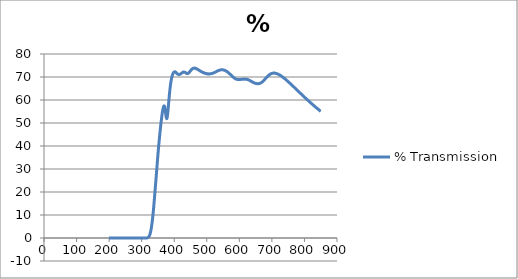
| Category | % Transmission |
|---|---|
| 850.0 | 55.093 |
| 849.0 | 55.172 |
| 848.0 | 55.34 |
| 847.0 | 55.429 |
| 846.0 | 55.517 |
| 845.0 | 55.6 |
| 844.0 | 55.826 |
| 843.0 | 55.848 |
| 842.0 | 56.032 |
| 841.0 | 56.143 |
| 840.0 | 56.236 |
| 839.0 | 56.34 |
| 838.0 | 56.465 |
| 837.0 | 56.565 |
| 836.0 | 56.703 |
| 835.0 | 56.844 |
| 834.0 | 56.947 |
| 833.0 | 57.083 |
| 832.0 | 57.176 |
| 831.0 | 57.297 |
| 830.0 | 57.442 |
| 829.0 | 57.563 |
| 828.0 | 57.641 |
| 827.0 | 57.807 |
| 826.0 | 57.919 |
| 825.0 | 58.056 |
| 824.0 | 58.169 |
| 823.0 | 58.321 |
| 822.0 | 58.401 |
| 821.0 | 58.522 |
| 820.0 | 58.689 |
| 819.0 | 58.756 |
| 818.0 | 58.904 |
| 817.0 | 59.019 |
| 816.0 | 59.156 |
| 815.0 | 59.295 |
| 814.0 | 59.434 |
| 813.0 | 59.566 |
| 812.0 | 59.705 |
| 811.0 | 59.828 |
| 810.0 | 59.941 |
| 809.0 | 60.076 |
| 808.0 | 60.173 |
| 807.0 | 60.359 |
| 806.0 | 60.467 |
| 805.0 | 60.612 |
| 804.0 | 60.729 |
| 803.0 | 60.873 |
| 802.0 | 60.963 |
| 801.0 | 61.109 |
| 800.0 | 61.269 |
| 799.0 | 61.376 |
| 798.0 | 61.522 |
| 797.0 | 61.657 |
| 796.0 | 61.763 |
| 795.0 | 61.901 |
| 794.0 | 62.059 |
| 793.0 | 62.186 |
| 792.0 | 62.341 |
| 791.0 | 62.46 |
| 790.0 | 62.595 |
| 789.0 | 62.729 |
| 788.0 | 62.89 |
| 787.0 | 62.999 |
| 786.0 | 63.148 |
| 785.0 | 63.27 |
| 784.0 | 63.4 |
| 783.0 | 63.551 |
| 782.0 | 63.673 |
| 781.0 | 63.826 |
| 780.0 | 63.949 |
| 779.0 | 64.107 |
| 778.0 | 64.192 |
| 777.0 | 64.368 |
| 776.0 | 64.504 |
| 775.0 | 64.627 |
| 774.0 | 64.774 |
| 773.0 | 64.925 |
| 772.0 | 65.028 |
| 771.0 | 65.17 |
| 770.0 | 65.334 |
| 769.0 | 65.443 |
| 768.0 | 65.603 |
| 767.0 | 65.726 |
| 766.0 | 65.85 |
| 765.0 | 65.993 |
| 764.0 | 66.155 |
| 763.0 | 66.261 |
| 762.0 | 66.41 |
| 761.0 | 66.547 |
| 760.0 | 66.639 |
| 759.0 | 66.801 |
| 758.0 | 66.952 |
| 757.0 | 67.084 |
| 756.0 | 67.212 |
| 755.0 | 67.343 |
| 754.0 | 67.445 |
| 753.0 | 67.586 |
| 752.0 | 67.717 |
| 751.0 | 67.841 |
| 750.0 | 67.983 |
| 749.0 | 68.107 |
| 748.0 | 68.205 |
| 747.0 | 68.344 |
| 746.0 | 68.482 |
| 745.0 | 68.612 |
| 744.0 | 68.735 |
| 743.0 | 68.857 |
| 742.0 | 68.937 |
| 741.0 | 69.092 |
| 740.0 | 69.214 |
| 739.0 | 69.337 |
| 738.0 | 69.45 |
| 737.0 | 69.561 |
| 736.0 | 69.636 |
| 735.0 | 69.789 |
| 734.0 | 69.886 |
| 733.0 | 69.977 |
| 732.0 | 70.091 |
| 731.0 | 70.191 |
| 730.0 | 70.294 |
| 729.0 | 70.418 |
| 728.0 | 70.479 |
| 727.0 | 70.569 |
| 726.0 | 70.69 |
| 725.0 | 70.784 |
| 724.0 | 70.827 |
| 723.0 | 70.924 |
| 722.0 | 71.015 |
| 721.0 | 71.096 |
| 720.0 | 71.172 |
| 719.0 | 71.238 |
| 718.0 | 71.277 |
| 717.0 | 71.352 |
| 716.0 | 71.443 |
| 715.0 | 71.482 |
| 714.0 | 71.521 |
| 713.0 | 71.55 |
| 712.0 | 71.564 |
| 711.0 | 71.628 |
| 710.0 | 71.665 |
| 709.0 | 71.688 |
| 708.0 | 71.708 |
| 707.0 | 71.719 |
| 706.0 | 71.679 |
| 705.0 | 71.7 |
| 704.0 | 71.698 |
| 703.0 | 71.644 |
| 702.0 | 71.649 |
| 701.0 | 71.587 |
| 700.0 | 71.546 |
| 699.0 | 71.522 |
| 698.0 | 71.467 |
| 697.0 | 71.399 |
| 696.0 | 71.32 |
| 695.0 | 71.224 |
| 694.0 | 71.104 |
| 693.0 | 71.053 |
| 692.0 | 70.964 |
| 691.0 | 70.837 |
| 690.0 | 70.736 |
| 689.0 | 70.597 |
| 688.0 | 70.445 |
| 687.0 | 70.276 |
| 686.0 | 70.183 |
| 685.0 | 70.042 |
| 684.0 | 69.864 |
| 683.0 | 69.727 |
| 682.0 | 69.544 |
| 681.0 | 69.385 |
| 680.0 | 69.247 |
| 679.0 | 69.081 |
| 678.0 | 68.898 |
| 677.0 | 68.751 |
| 676.0 | 68.594 |
| 675.0 | 68.442 |
| 674.0 | 68.31 |
| 673.0 | 68.181 |
| 672.0 | 68.039 |
| 671.0 | 67.925 |
| 670.0 | 67.802 |
| 669.0 | 67.697 |
| 668.0 | 67.634 |
| 667.0 | 67.525 |
| 666.0 | 67.423 |
| 665.0 | 67.359 |
| 664.0 | 67.293 |
| 663.0 | 67.234 |
| 662.0 | 67.199 |
| 661.0 | 67.184 |
| 660.0 | 67.153 |
| 659.0 | 67.128 |
| 658.0 | 67.096 |
| 657.0 | 67.075 |
| 656.0 | 67.092 |
| 655.0 | 67.111 |
| 654.0 | 67.117 |
| 653.0 | 67.129 |
| 652.0 | 67.139 |
| 651.0 | 67.166 |
| 650.0 | 67.237 |
| 649.0 | 67.277 |
| 648.0 | 67.307 |
| 647.0 | 67.369 |
| 646.0 | 67.42 |
| 645.0 | 67.481 |
| 644.0 | 67.555 |
| 643.0 | 67.642 |
| 642.0 | 67.697 |
| 641.0 | 67.774 |
| 640.0 | 67.848 |
| 639.0 | 67.923 |
| 638.0 | 68.022 |
| 637.0 | 68.077 |
| 636.0 | 68.159 |
| 635.0 | 68.252 |
| 634.0 | 68.318 |
| 633.0 | 68.389 |
| 632.0 | 68.473 |
| 631.0 | 68.568 |
| 630.0 | 68.622 |
| 629.0 | 68.691 |
| 628.0 | 68.749 |
| 627.0 | 68.813 |
| 626.0 | 68.884 |
| 625.0 | 68.911 |
| 624.0 | 68.96 |
| 623.0 | 68.993 |
| 622.0 | 69.009 |
| 621.0 | 69.053 |
| 620.0 | 69.081 |
| 619.0 | 69.068 |
| 618.0 | 69.073 |
| 617.0 | 69.084 |
| 616.0 | 69.065 |
| 615.0 | 69.064 |
| 614.0 | 69.062 |
| 613.0 | 69.062 |
| 612.0 | 69.046 |
| 611.0 | 69.051 |
| 610.0 | 69.027 |
| 609.0 | 69 |
| 608.0 | 69 |
| 607.0 | 68.993 |
| 606.0 | 68.977 |
| 605.0 | 68.959 |
| 604.0 | 68.928 |
| 603.0 | 68.908 |
| 602.0 | 68.925 |
| 601.0 | 68.91 |
| 600.0 | 68.913 |
| 599.0 | 68.928 |
| 598.0 | 68.905 |
| 597.0 | 68.9 |
| 596.0 | 68.92 |
| 595.0 | 68.934 |
| 594.0 | 68.938 |
| 593.0 | 68.974 |
| 592.0 | 68.996 |
| 591.0 | 69.032 |
| 590.0 | 69.116 |
| 589.0 | 69.175 |
| 588.0 | 69.228 |
| 587.0 | 69.332 |
| 586.0 | 69.408 |
| 585.0 | 69.506 |
| 584.0 | 69.629 |
| 583.0 | 69.731 |
| 582.0 | 69.838 |
| 581.0 | 69.97 |
| 580.0 | 70.087 |
| 579.0 | 70.222 |
| 578.0 | 70.358 |
| 577.0 | 70.509 |
| 576.0 | 70.653 |
| 575.0 | 70.776 |
| 574.0 | 70.911 |
| 573.0 | 71.025 |
| 572.0 | 71.187 |
| 571.0 | 71.316 |
| 570.0 | 71.421 |
| 569.0 | 71.576 |
| 568.0 | 71.679 |
| 567.0 | 71.798 |
| 566.0 | 71.952 |
| 565.0 | 72.066 |
| 564.0 | 72.168 |
| 563.0 | 72.283 |
| 562.0 | 72.347 |
| 561.0 | 72.467 |
| 560.0 | 72.519 |
| 559.0 | 72.626 |
| 558.0 | 72.714 |
| 557.0 | 72.811 |
| 556.0 | 72.863 |
| 555.0 | 72.913 |
| 554.0 | 72.942 |
| 553.0 | 72.986 |
| 552.0 | 73.044 |
| 551.0 | 73.082 |
| 550.0 | 73.109 |
| 549.0 | 73.122 |
| 548.0 | 73.113 |
| 547.0 | 73.13 |
| 546.0 | 73.182 |
| 545.0 | 73.132 |
| 544.0 | 73.106 |
| 543.0 | 73.097 |
| 542.0 | 73.031 |
| 541.0 | 73.043 |
| 540.0 | 73.008 |
| 539.0 | 72.98 |
| 538.0 | 72.924 |
| 537.0 | 72.866 |
| 536.0 | 72.811 |
| 535.0 | 72.749 |
| 534.0 | 72.718 |
| 533.0 | 72.629 |
| 532.0 | 72.558 |
| 531.0 | 72.479 |
| 530.0 | 72.373 |
| 529.0 | 72.323 |
| 528.0 | 72.275 |
| 527.0 | 72.169 |
| 526.0 | 72.122 |
| 525.0 | 72.059 |
| 524.0 | 71.953 |
| 523.0 | 71.903 |
| 522.0 | 71.857 |
| 521.0 | 71.79 |
| 520.0 | 71.734 |
| 519.0 | 71.69 |
| 518.0 | 71.616 |
| 517.0 | 71.572 |
| 516.0 | 71.56 |
| 515.0 | 71.503 |
| 514.0 | 71.482 |
| 513.0 | 71.43 |
| 512.0 | 71.387 |
| 511.0 | 71.395 |
| 510.0 | 71.372 |
| 509.0 | 71.345 |
| 508.0 | 71.341 |
| 507.0 | 71.335 |
| 506.0 | 71.308 |
| 505.0 | 71.336 |
| 504.0 | 71.423 |
| 503.0 | 71.318 |
| 502.0 | 71.398 |
| 501.0 | 71.396 |
| 500.0 | 71.41 |
| 499.0 | 71.446 |
| 498.0 | 71.537 |
| 497.0 | 71.505 |
| 496.0 | 71.594 |
| 495.0 | 71.618 |
| 494.0 | 71.615 |
| 493.0 | 71.69 |
| 492.0 | 71.767 |
| 491.0 | 71.789 |
| 490.0 | 71.906 |
| 489.0 | 71.891 |
| 488.0 | 71.98 |
| 487.0 | 72.038 |
| 486.0 | 72.141 |
| 485.0 | 72.191 |
| 484.0 | 72.271 |
| 483.0 | 72.36 |
| 482.0 | 72.433 |
| 481.0 | 72.522 |
| 480.0 | 72.615 |
| 479.0 | 72.653 |
| 478.0 | 72.781 |
| 477.0 | 72.878 |
| 476.0 | 72.937 |
| 475.0 | 73.041 |
| 474.0 | 73.15 |
| 473.0 | 73.217 |
| 472.0 | 73.315 |
| 471.0 | 73.383 |
| 470.0 | 73.452 |
| 469.0 | 73.516 |
| 468.0 | 73.656 |
| 467.0 | 73.657 |
| 466.0 | 73.774 |
| 465.0 | 73.77 |
| 464.0 | 73.807 |
| 463.0 | 73.843 |
| 462.0 | 73.87 |
| 461.0 | 73.885 |
| 460.0 | 73.827 |
| 459.0 | 73.834 |
| 458.0 | 73.716 |
| 457.0 | 73.672 |
| 456.0 | 73.614 |
| 455.0 | 73.429 |
| 454.0 | 73.372 |
| 453.0 | 73.195 |
| 452.0 | 73.056 |
| 451.0 | 72.876 |
| 450.0 | 72.741 |
| 449.0 | 72.547 |
| 448.0 | 72.36 |
| 447.0 | 72.214 |
| 446.0 | 71.97 |
| 445.0 | 71.881 |
| 444.0 | 71.727 |
| 443.0 | 71.619 |
| 442.0 | 71.521 |
| 441.0 | 71.478 |
| 440.0 | 71.467 |
| 439.0 | 71.49 |
| 438.0 | 71.62 |
| 437.0 | 71.642 |
| 436.0 | 71.812 |
| 435.0 | 71.867 |
| 434.0 | 71.97 |
| 433.0 | 72.013 |
| 432.0 | 72.067 |
| 431.0 | 72.059 |
| 430.0 | 72.075 |
| 429.0 | 72.164 |
| 428.0 | 72.09 |
| 427.0 | 72.086 |
| 426.0 | 72.001 |
| 425.0 | 71.889 |
| 424.0 | 71.801 |
| 423.0 | 71.711 |
| 422.0 | 71.573 |
| 421.0 | 71.488 |
| 420.0 | 71.382 |
| 419.0 | 71.294 |
| 418.0 | 71.211 |
| 417.0 | 71.148 |
| 416.0 | 71.084 |
| 415.0 | 71.08 |
| 414.0 | 71.122 |
| 413.0 | 71.084 |
| 412.0 | 71.189 |
| 411.0 | 71.254 |
| 410.0 | 71.337 |
| 409.0 | 71.493 |
| 408.0 | 71.627 |
| 407.0 | 71.779 |
| 406.0 | 71.904 |
| 405.0 | 72.075 |
| 404.0 | 72.119 |
| 403.0 | 72.246 |
| 402.0 | 72.295 |
| 401.0 | 72.215 |
| 400.0 | 72.207 |
| 399.0 | 72.086 |
| 398.0 | 71.941 |
| 397.0 | 71.68 |
| 396.0 | 71.423 |
| 395.0 | 71.017 |
| 394.0 | 70.618 |
| 393.0 | 70.112 |
| 392.0 | 69.49 |
| 391.0 | 68.818 |
| 390.0 | 67.981 |
| 389.0 | 67.078 |
| 388.0 | 66.001 |
| 387.0 | 64.813 |
| 386.0 | 63.459 |
| 385.0 | 62.045 |
| 384.0 | 60.507 |
| 383.0 | 58.873 |
| 382.0 | 57.257 |
| 381.0 | 55.637 |
| 380.0 | 54.201 |
| 379.0 | 53.017 |
| 378.0 | 52.146 |
| 377.0 | 51.876 |
| 376.0 | 52.144 |
| 375.0 | 52.86 |
| 374.0 | 53.849 |
| 373.0 | 54.957 |
| 372.0 | 55.975 |
| 371.0 | 56.77 |
| 370.0 | 57.279 |
| 369.0 | 57.471 |
| 368.0 | 57.293 |
| 367.0 | 56.966 |
| 366.0 | 56.394 |
| 365.0 | 55.69 |
| 364.0 | 54.909 |
| 363.0 | 54.003 |
| 362.0 | 52.987 |
| 361.0 | 51.931 |
| 360.0 | 50.778 |
| 359.0 | 49.548 |
| 358.0 | 48.267 |
| 357.0 | 46.946 |
| 356.0 | 45.512 |
| 355.0 | 44.1 |
| 354.0 | 42.628 |
| 353.0 | 41.112 |
| 352.0 | 39.561 |
| 351.0 | 37.96 |
| 350.0 | 36.276 |
| 349.0 | 34.556 |
| 348.0 | 32.781 |
| 347.0 | 30.98 |
| 346.0 | 29.19 |
| 345.0 | 27.406 |
| 344.0 | 25.602 |
| 343.0 | 23.837 |
| 342.0 | 22.063 |
| 341.0 | 20.301 |
| 340.0 | 18.544 |
| 339.0 | 16.825 |
| 338.0 | 15.124 |
| 337.0 | 13.487 |
| 336.0 | 11.94 |
| 335.0 | 10.487 |
| 334.0 | 9.133 |
| 333.0 | 7.88 |
| 332.0 | 6.716 |
| 331.0 | 5.652 |
| 330.0 | 4.68 |
| 329.0 | 3.817 |
| 328.0 | 3.057 |
| 327.0 | 2.41 |
| 326.0 | 1.867 |
| 325.0 | 1.422 |
| 324.0 | 1.062 |
| 323.0 | 0.777 |
| 322.0 | 0.552 |
| 321.0 | 0.386 |
| 320.0 | 0.261 |
| 319.0 | 0.17 |
| 318.0 | 0.106 |
| 317.0 | 0.066 |
| 316.0 | 0.037 |
| 315.0 | 0.019 |
| 314.0 | 0.012 |
| 313.0 | 0.005 |
| 312.0 | 0.003 |
| 311.0 | 0.001 |
| 310.0 | -0.001 |
| 309.0 | -0.002 |
| 308.0 | 0 |
| 307.0 | -0.002 |
| 306.0 | 0.003 |
| 305.0 | 0.001 |
| 304.0 | -0.001 |
| 303.0 | -0.001 |
| 302.0 | 0.001 |
| 301.0 | 0 |
| 300.0 | 0.002 |
| 299.0 | 0 |
| 298.0 | -0.002 |
| 297.0 | -0.001 |
| 296.0 | 0.002 |
| 295.0 | 0.002 |
| 294.0 | 0.001 |
| 293.0 | -0.001 |
| 292.0 | -0.002 |
| 291.0 | 0 |
| 290.0 | 0.002 |
| 289.0 | -0.001 |
| 288.0 | 0.002 |
| 287.0 | -0.001 |
| 286.0 | -0.002 |
| 285.0 | -0.001 |
| 284.0 | 0.002 |
| 283.0 | 0.001 |
| 282.0 | 0.001 |
| 281.0 | -0.001 |
| 280.0 | -0.003 |
| 279.0 | 0 |
| 278.0 | 0.001 |
| 277.0 | -0.001 |
| 276.0 | 0.002 |
| 275.0 | 0 |
| 274.0 | -0.001 |
| 273.0 | 0.001 |
| 272.0 | 0.001 |
| 271.0 | 0 |
| 270.0 | 0.002 |
| 269.0 | 0 |
| 268.0 | -0.002 |
| 267.0 | 0 |
| 266.0 | 0 |
| 265.0 | 0 |
| 264.0 | 0.002 |
| 263.0 | 0 |
| 262.0 | -0.002 |
| 261.0 | 0 |
| 260.0 | 0 |
| 259.0 | -0.001 |
| 258.0 | 0.002 |
| 257.0 | -0.001 |
| 256.0 | -0.003 |
| 255.0 | 0 |
| 254.0 | 0 |
| 253.0 | 0 |
| 252.0 | 0.003 |
| 251.0 | 0.001 |
| 250.0 | -0.002 |
| 249.0 | 0 |
| 248.0 | 0.001 |
| 247.0 | 0.001 |
| 246.0 | 0.002 |
| 245.0 | -0.001 |
| 244.0 | -0.003 |
| 243.0 | -0.001 |
| 242.0 | 0 |
| 241.0 | 0 |
| 240.0 | 0.002 |
| 239.0 | 0 |
| 238.0 | -0.002 |
| 237.0 | 0 |
| 236.0 | -0.001 |
| 235.0 | 0.001 |
| 234.0 | 0.003 |
| 233.0 | 0 |
| 232.0 | 0 |
| 231.0 | 0.001 |
| 230.0 | -0.003 |
| 229.0 | -0.001 |
| 228.0 | 0.003 |
| 227.0 | 0.001 |
| 226.0 | -0.002 |
| 225.0 | -0.001 |
| 224.0 | -0.001 |
| 223.0 | 0 |
| 222.0 | 0.002 |
| 221.0 | 0 |
| 220.0 | -0.001 |
| 219.0 | 0.001 |
| 218.0 | -0.001 |
| 217.0 | -0.001 |
| 216.0 | 0.002 |
| 215.0 | 0 |
| 214.0 | -0.001 |
| 213.0 | 0 |
| 212.0 | -0.001 |
| 211.0 | 0.001 |
| 210.0 | 0.003 |
| 209.0 | -0.001 |
| 208.0 | -0.003 |
| 207.0 | 0 |
| 206.0 | -0.001 |
| 205.0 | 0.001 |
| 204.0 | 0.003 |
| 203.0 | 0.001 |
| 202.0 | -0.001 |
| 201.0 | 0.001 |
| 200.0 | 0 |